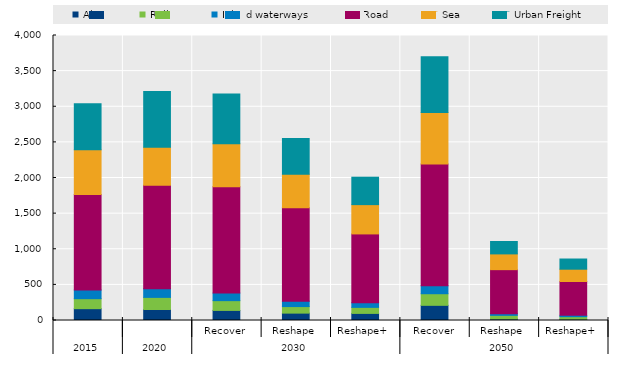
| Category | Air | Rail | Inland waterways | Road | Sea | Urban Freight |
|---|---|---|---|---|---|---|
| 0 | 166.014 | 140.326 | 122.136 | 1339.668 | 629.356 | 643.011 |
| 1 | 154.701 | 169.753 | 122.489 | 1449.968 | 535.31 | 780.322 |
| 2 | 141.534 | 137.073 | 106.095 | 1491.978 | 602.479 | 698.164 |
| 3 | 103.461 | 91.883 | 75.953 | 1310.657 | 469.013 | 504.162 |
| 4 | 99.585 | 84.541 | 64.998 | 966.011 | 411.153 | 384.985 |
| 5 | 212.884 | 162.905 | 113.085 | 1707.641 | 721.68 | 782.505 |
| 6 | 21.162 | 51.044 | 22.649 | 618.68 | 221.201 | 174.252 |
| 7 | 18.199 | 35.51 | 18.313 | 475.527 | 172.46 | 143.042 |